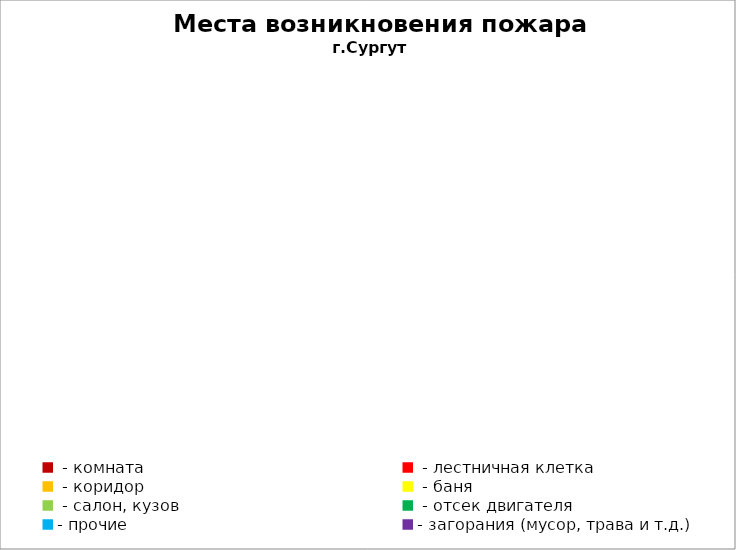
| Category | Места возникновения пожара |
|---|---|
|  - комната | 4 |
|  - лестничная клетка | 1 |
|  - коридор | 0 |
|  - баня | 2 |
|  - салон, кузов | 2 |
|  - отсек двигателя | 12 |
| - прочие | 32 |
| - загорания (мусор, трава и т.д.)  | 5 |